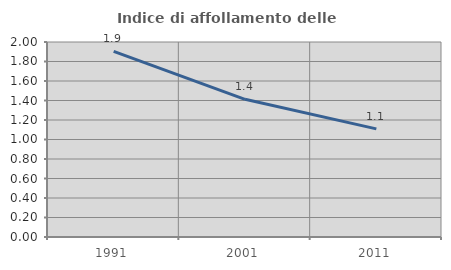
| Category | Indice di affollamento delle abitazioni  |
|---|---|
| 1991.0 | 1.904 |
| 2001.0 | 1.412 |
| 2011.0 | 1.109 |